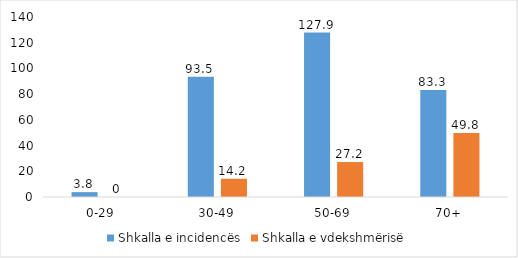
| Category | Shkalla e incidencës | Shkalla e vdekshmërisë |
|---|---|---|
| 0-29 | 3.8 | 0 |
| 30-49 | 93.5 | 14.2 |
| 50-69 | 127.9 | 27.2 |
| 70+ | 83.3 | 49.8 |